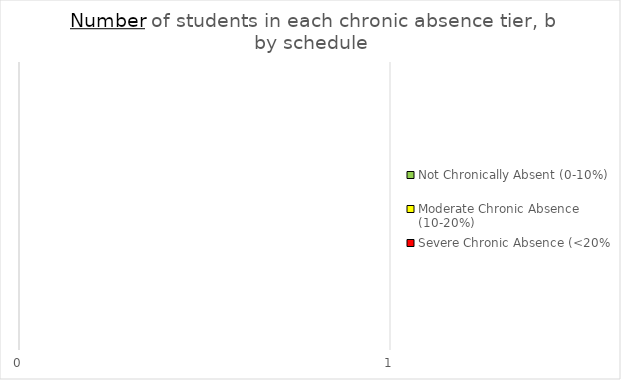
| Category | Not Chronically Absent (0-10%) | Moderate Chronic Absence (10-20%) | Severe Chronic Absence (<20%) |
|---|---|---|---|
|  | 0 | 0 | 0 |